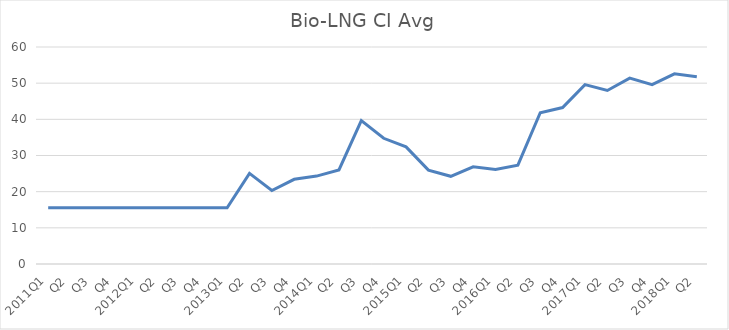
| Category | Series 0 |
|---|---|
| 2011Q1 | 15.56 |
| Q2 | 15.56 |
| Q3 | 15.56 |
| Q4 | 15.56 |
| 2012Q1 | 15.56 |
| Q2 | 15.56 |
| Q3 | 15.56 |
| Q4 | 15.56 |
| 2013Q1 | 15.56 |
| Q2 | 25.06 |
| Q3 | 20.32 |
| Q4 | 23.42 |
| 2014Q1 | 24.31 |
| Q2 | 26 |
| Q3 | 39.65 |
| Q4 | 34.76 |
| 2015Q1 | 32.38 |
| Q2 | 25.96 |
| Q3 | 24.25 |
| Q4 | 26.86 |
| 2016Q1 | 26.14 |
| Q2 | 27.34 |
| Q3 | 41.83 |
| Q4 | 43.25 |
| 2017Q1 | 49.59 |
| Q2 | 47.97 |
| Q3 | 51.38 |
| Q4 | 49.57 |
| 2018Q1 | 52.59 |
| Q2 | 51.78 |